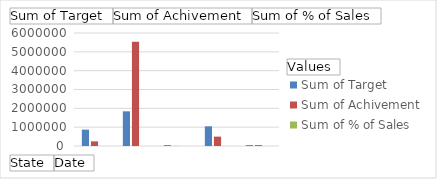
| Category | Sum of Target | Sum of Achivement | Sum of % of Sales |
|---|---|---|---|
| 0 | 868799 | 246548 | 28.378 |
| 1 | 1841127 | 5541341 | 300.975 |
| 2 | 45656 | 4545 | 9.955 |
| 3 | 1043962 | 497452 | 47.65 |
| 4 | 45656 | 45454 | 99.558 |